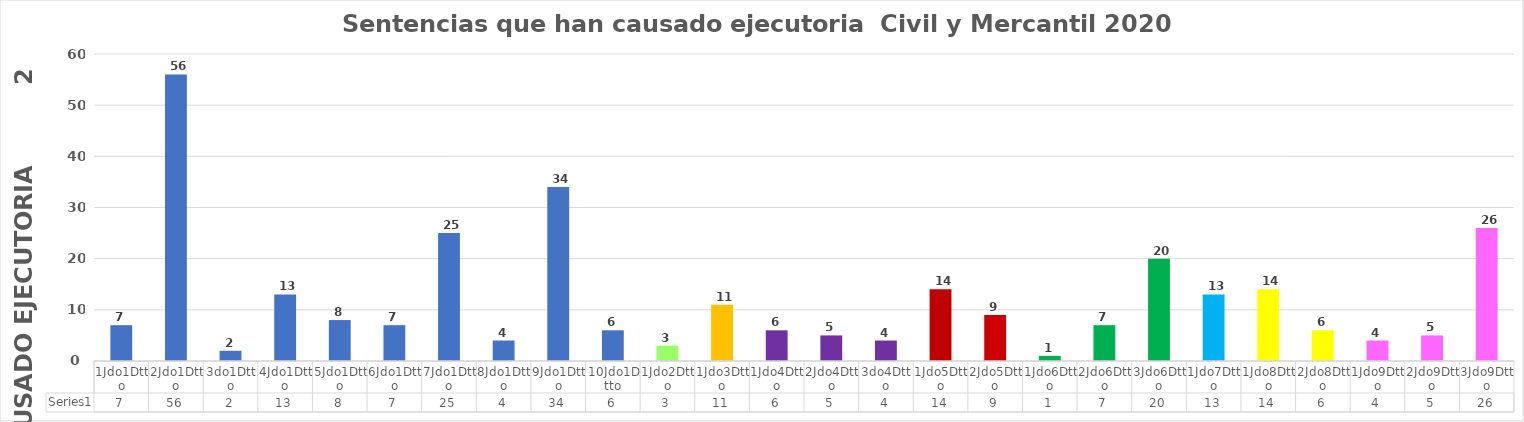
| Category | Series 0 |
|---|---|
| 1Jdo1Dtto | 7 |
| 2Jdo1Dtto | 56 |
| 3do1Dtto | 2 |
| 4Jdo1Dtto | 13 |
| 5Jdo1Dtto | 8 |
| 6Jdo1Dtto | 7 |
| 7Jdo1Dtto | 25 |
| 8Jdo1Dtto | 4 |
| 9Jdo1Dtto | 34 |
| 10Jdo1Dtto | 6 |
| 1Jdo2Dtto | 3 |
| 1Jdo3Dtto | 11 |
| 1Jdo4Dtto | 6 |
| 2Jdo4Dtto | 5 |
| 3do4Dtto | 4 |
| 1Jdo5Dtto | 14 |
| 2Jdo5Dtto | 9 |
| 1Jdo6Dtto | 1 |
| 2Jdo6Dtto | 7 |
| 3Jdo6Dtto | 20 |
| 1Jdo7Dtto | 13 |
| 1Jdo8Dtto | 14 |
| 2Jdo8Dtto | 6 |
| 1Jdo9Dtto | 4 |
| 2Jdo9Dtto | 5 |
| 3Jdo9Dtto | 26 |